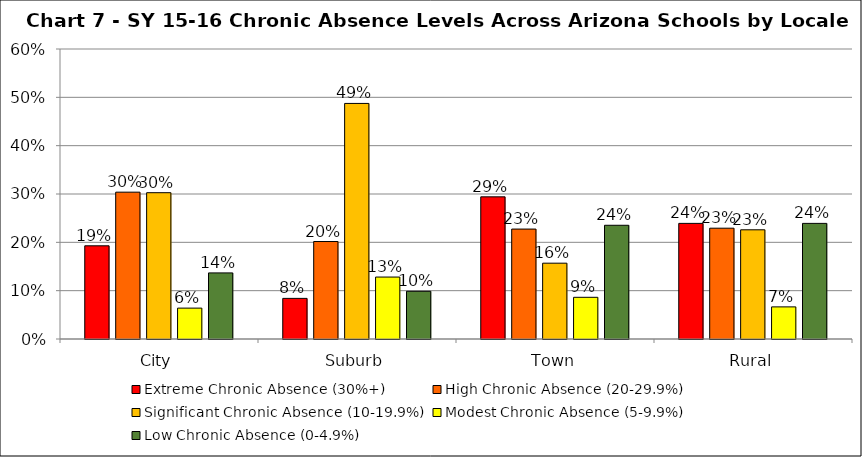
| Category | Extreme Chronic Absence (30%+) | High Chronic Absence (20-29.9%) | Significant Chronic Absence (10-19.9%) | Modest Chronic Absence (5-9.9%) | Low Chronic Absence (0-4.9%) |
|---|---|---|---|---|---|
| 0 | 0.193 | 0.304 | 0.303 | 0.064 | 0.137 |
| 1 | 0.084 | 0.202 | 0.487 | 0.128 | 0.099 |
| 2 | 0.294 | 0.227 | 0.157 | 0.086 | 0.235 |
| 3 | 0.239 | 0.229 | 0.226 | 0.066 | 0.239 |